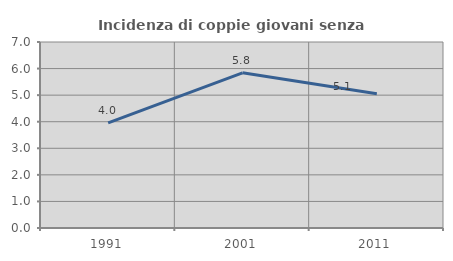
| Category | Incidenza di coppie giovani senza figli |
|---|---|
| 1991.0 | 3.954 |
| 2001.0 | 5.839 |
| 2011.0 | 5.053 |